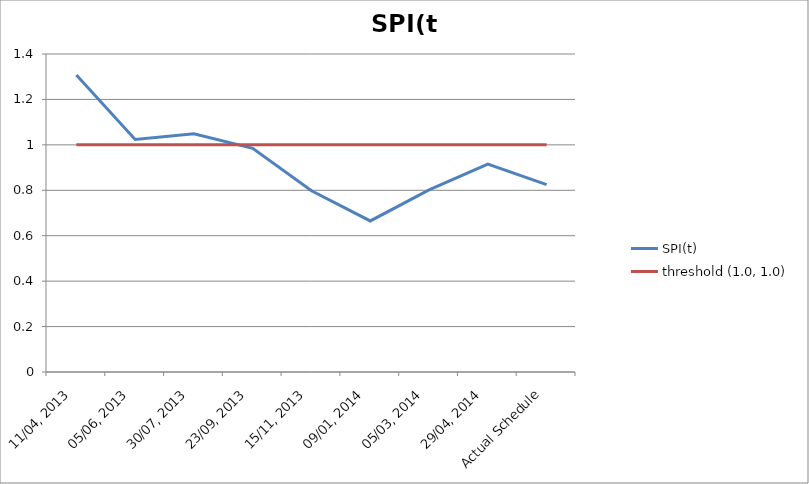
| Category | SPI(t) | threshold (1.0, 1.0) |
|---|---|---|
| 11/04, 2013 | 1.308 | 1 |
| 05/06, 2013 | 1.024 | 1 |
| 30/07, 2013 | 1.049 | 1 |
| 23/09, 2013 | 0.985 | 1 |
| 15/11, 2013 | 0.798 | 1 |
| 09/01, 2014 | 0.665 | 1 |
| 05/03, 2014 | 0.802 | 1 |
| 29/04, 2014 | 0.915 | 1 |
| Actual Schedule | 0.825 | 1 |